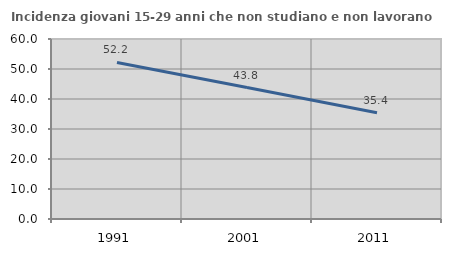
| Category | Incidenza giovani 15-29 anni che non studiano e non lavorano  |
|---|---|
| 1991.0 | 52.198 |
| 2001.0 | 43.805 |
| 2011.0 | 35.425 |